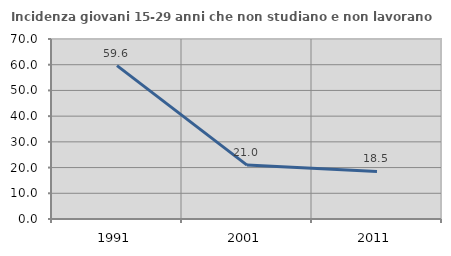
| Category | Incidenza giovani 15-29 anni che non studiano e non lavorano  |
|---|---|
| 1991.0 | 59.637 |
| 2001.0 | 20.952 |
| 2011.0 | 18.478 |